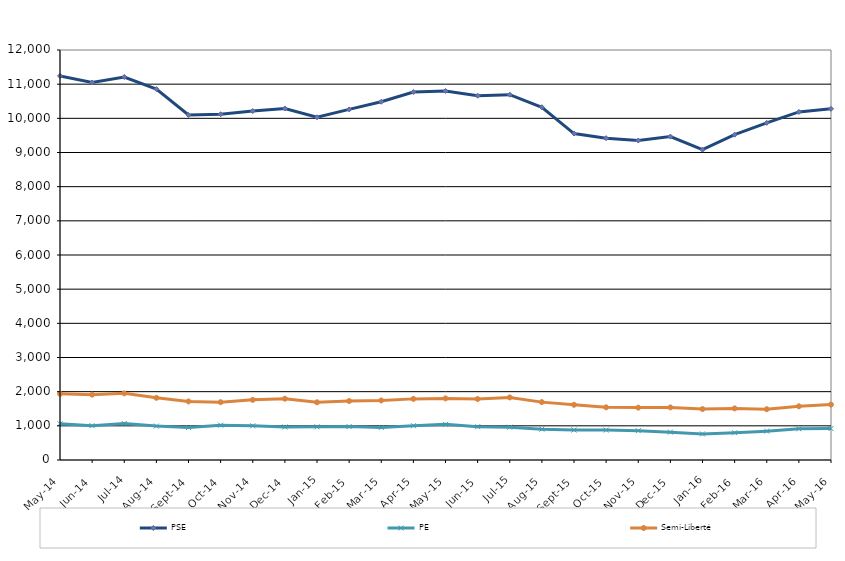
| Category | PSE | PE | Semi-Liberté |
|---|---|---|---|
| 2014-05-01 | 11241 | 1062 | 1937 |
| 2014-06-01 | 11048 | 1005 | 1912 |
| 2014-07-01 | 11210 | 1068 | 1951 |
| 2014-08-01 | 10856 | 992 | 1820 |
| 2014-09-01 | 10098 | 951 | 1714 |
| 2014-10-01 | 10120 | 1018 | 1692 |
| 2014-11-01 | 10213 | 1000 | 1760 |
| 2014-12-01 | 10287 | 966 | 1794 |
| 2015-01-01 | 10030 | 970 | 1689 |
| 2015-02-01 | 10261 | 977 | 1726 |
| 2015-03-01 | 10485 | 954 | 1742 |
| 2015-04-01 | 10770 | 1003 | 1789 |
| 2015-05-01 | 10801 | 1043 | 1803 |
| 2015-06-01 | 10662 | 973 | 1785 |
| 2015-07-01 | 10692 | 961 | 1832 |
| 2015-08-01 | 10325 | 903 | 1694 |
| 2015-09-01 | 9555 | 878 | 1616 |
| 2015-10-01 | 9420 | 877 | 1542 |
| 2015-11-01 | 9350 | 859 | 1533 |
| 2015-12-01 | 9466 | 815 | 1539 |
| 2016-01-01 | 9081 | 764 | 1490 |
| 2016-02-01 | 9521 | 798 | 1510 |
| 2016-03-01 | 9868 | 845 | 1486 |
| 2016-04-01 | 10187 | 912 | 1572 |
| 2016-05-01 | 10278 | 920 | 1621 |